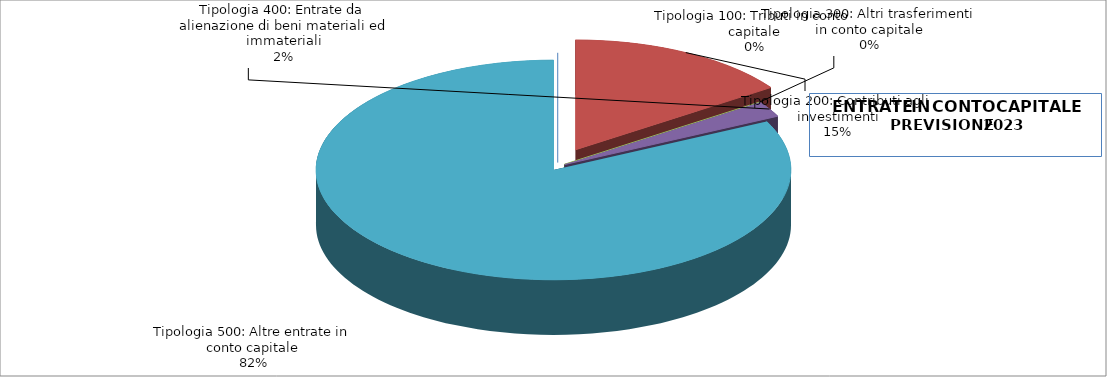
| Category | Series 0 |
|---|---|
| Tipologia 100: Tributi in conto capitale | 0 |
| Tipologia 200: Contributi agli investimenti | 1742865.18 |
| Tipologia 300: Altri trasferimenti in conto capitale | 0 |
| Tipologia 400: Entrate da alienazione di beni materiali ed immateriali | 265000 |
| Tipologia 500: Altre entrate in conto capitale | 9314453.62 |